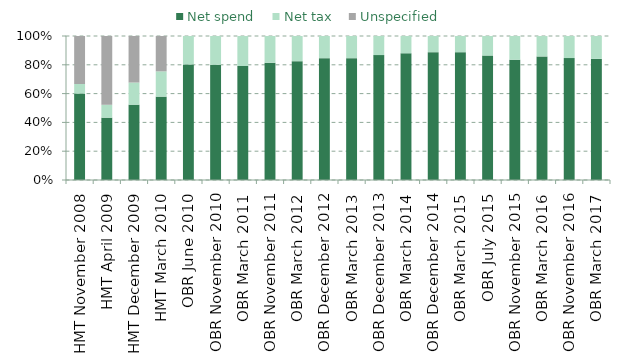
| Category | Net spend | Net tax | Unspecified  |
|---|---|---|---|
| HMT November 2008 | 1.8 | 0.2 | 1 |
| HMT April 2009 | 2.9 | 0.6 | 3.2 |
| HMT December 2009 | 3.4 | 1 | 2.1 |
| HMT March 2010 | 3.3 | 1 | 1.4 |
| OBR June 2010 | 5.7 | 1.4 | 0 |
| OBR November 2010 | 5.6 | 1.4 | 0 |
| OBR March 2011 | 5.7 | 1.5 | 0 |
| OBR November 2011 | 6.6 | 1.5 | 0 |
| OBR March 2012 | 6.6 | 1.4 | 0 |
| OBR December 2012 | 7.7 | 1.4 | 0 |
| OBR March 2013 | 7.7 | 1.4 | 0 |
| OBR December 2013 | 8.5 | 1.3 | 0 |
| OBR March 2014 | 8.8 | 1.2 | 0 |
| OBR December 2014 | 9.5 | 1.2 | 0 |
| OBR March 2015 | 8.7 | 1.1 | 0 |
| OBR July 2015 | 8.9 | 1.4 | 0 |
| OBR November 2015 | 8.6 | 1.7 | 0 |
| OBR March 2016 | 9.1 | 1.5 | 0 |
| OBR November 2016 | 8.95 | 1.62 | 0 |
| OBR March 2017 | 8.94 | 1.69 | 0 |